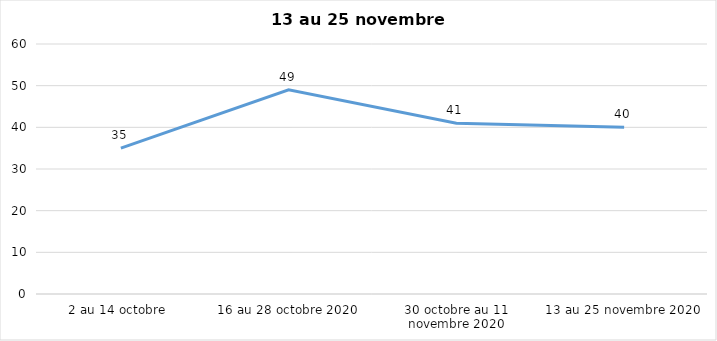
| Category | Series 0 |
|---|---|
| 2 au 14 octobre  | 35 |
| 16 au 28 octobre 2020 | 49 |
| 30 octobre au 11 novembre 2020 | 41 |
| 13 au 25 novembre 2020 | 40 |